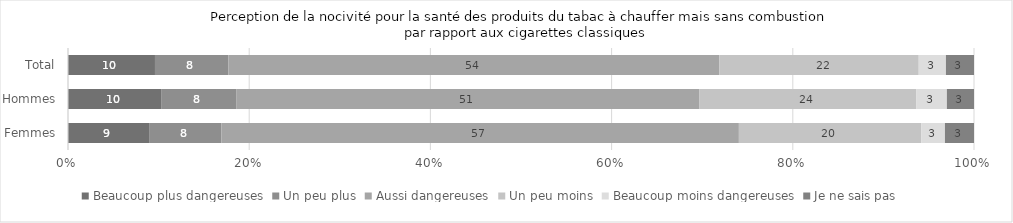
| Category | Beaucoup plus dangereuses | Un peu plus | Aussi dangereuses | Un peu moins | Beaucoup moins dangereuses | Je ne sais pas |
|---|---|---|---|---|---|---|
| Total | 9.6 | 8.1 | 54.2 | 22 | 3 | 3.1 |
| Hommes | 10.3 | 8.3 | 51.2 | 24 | 3.4 | 3 |
| Femmes | 9 | 7.9 | 57 | 20.1 | 2.6 | 3.2 |